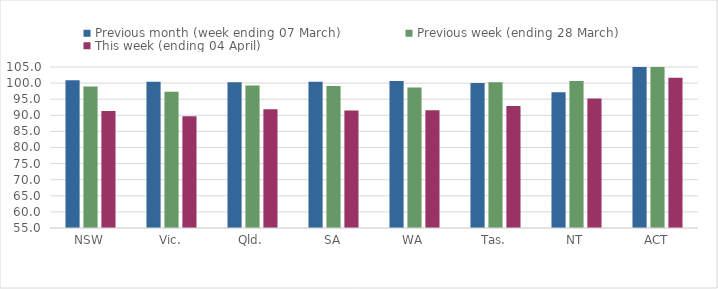
| Category | Previous month (week ending 07 March) | Previous week (ending 28 March) | This week (ending 04 April) |
|---|---|---|---|
| NSW | 100.881 | 98.906 | 91.369 |
| Vic. | 100.393 | 97.327 | 89.701 |
| Qld. | 100.254 | 99.274 | 91.907 |
| SA | 100.443 | 99.078 | 91.514 |
| WA | 100.664 | 98.606 | 91.55 |
| Tas. | 100 | 100.285 | 92.877 |
| NT | 97.171 | 100.615 | 95.203 |
| ACT | 105.177 | 108.801 | 101.639 |